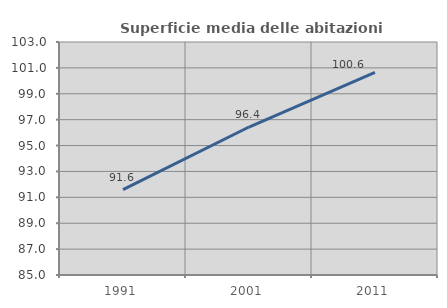
| Category | Superficie media delle abitazioni occupate |
|---|---|
| 1991.0 | 91.59 |
| 2001.0 | 96.431 |
| 2011.0 | 100.649 |